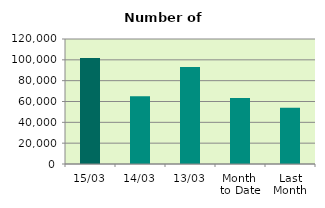
| Category | Series 0 |
|---|---|
| 15/03 | 101698 |
| 14/03 | 65056 |
| 13/03 | 93056 |
| Month 
to Date | 63381.455 |
| Last
Month | 54034.8 |